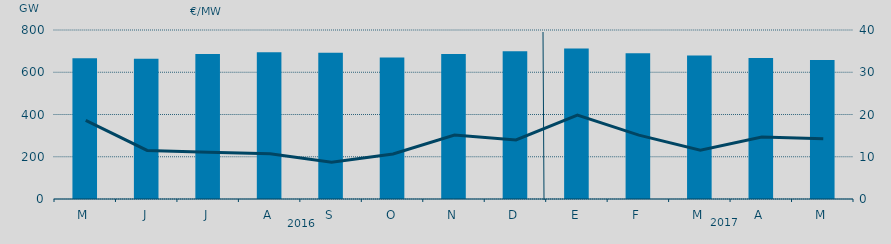
| Category | Energia (MWh) a subir |
|---|---|
| M | 666.328 |
| J | 664.292 |
| J | 686.788 |
| A | 694.56 |
| S | 691.889 |
| O | 669.591 |
| N | 686.044 |
| D | 698.836 |
| E | 712.52 |
| F | 690.067 |
| M | 679.79 |
| A | 667.793 |
| M | 657.634 |